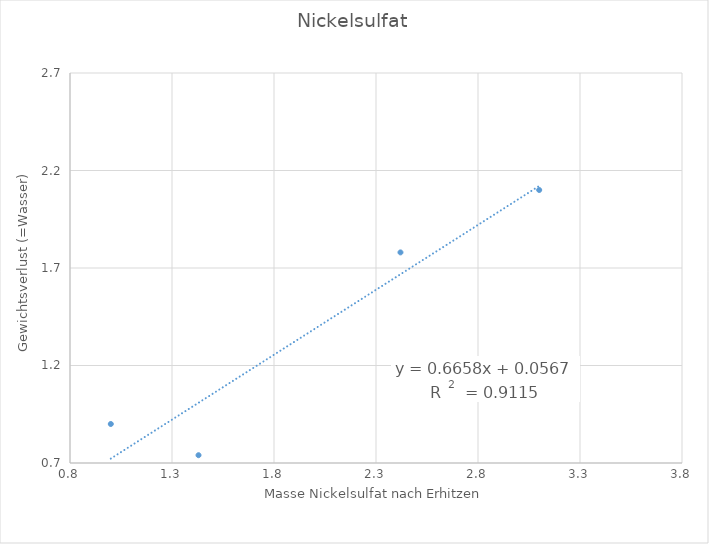
| Category | Series 0 |
|---|---|
| 3.1 | 2.1 |
| 1.43 | 0.74 |
| 2.42 | 1.78 |
| 1.0 | 0.9 |